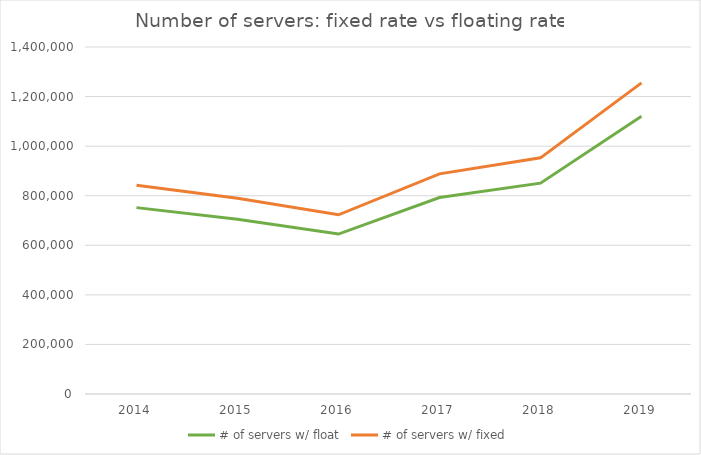
| Category | # of servers w/ float | # of servers w/ fixed |
|---|---|---|
| 2014.0 | 751979.454 | 842363.127 |
| 2015.0 | 705259.292 | 790027.466 |
| 2016.0 | 645383.203 | 722954.61 |
| 2017.0 | 792866.098 | 888164.114 |
| 2018.0 | 850578.663 | 952813.403 |
| 2019.0 | 1120555.013 | 1255239.382 |